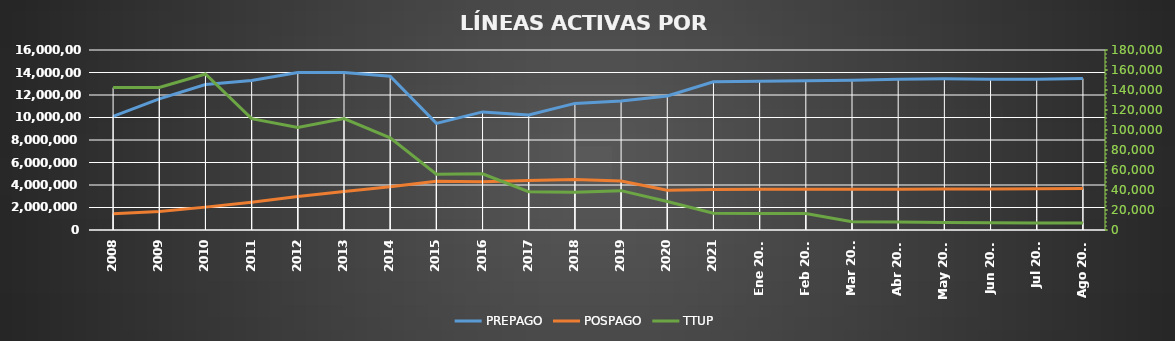
| Category | PREPAGO | POSPAGO |
|---|---|---|
| 2008 | 10097768 | 1452088 |
| 2009 | 11662294 | 1649838 |
| 2010 | 12929040 | 2033814 |
| 2011 | 13295834 | 2467378 |
| 2012 | 14008104 | 2976194 |
| 2013 | 14005126 | 3425277 |
| 2014 | 13666071 | 3846271 |
| 2015 | 9476240 | 4326937 |
| 2016 | 10498467 | 4293426 |
| 2017 | 10219457 | 4393703 |
| 2018 | 11254168 | 4480975 |
| 2019 | 11462048 | 4351686 |
| 2020 | 11917697 | 3539192 |
| 2021 | 13174530 | 3598383 |
| Ene 2022 | 13220510 | 3611202 |
| Feb 2022 | 13277237 | 3612124 |
| Mar 2022 | 13319621 | 3621700 |
| Abr 2022 | 13391496 | 3628201 |
| May 2022 | 13434704 | 3642700 |
| Jun 2022 | 13396249 | 3652440 |
| Jul 2022 | 13410009 | 3668962 |
| Ago 2022 | 13466342 | 3682408 |